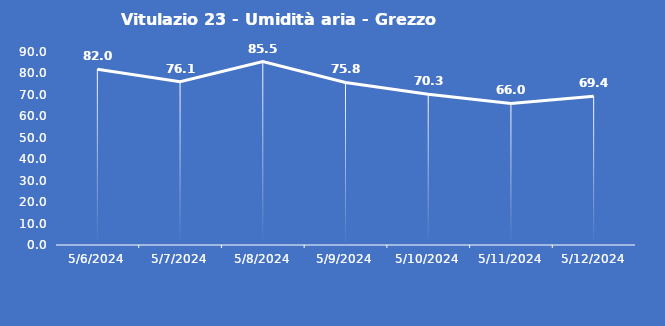
| Category | Vitulazio 23 - Umidità aria - Grezzo (%) |
|---|---|
| 5/6/24 | 82 |
| 5/7/24 | 76.1 |
| 5/8/24 | 85.5 |
| 5/9/24 | 75.8 |
| 5/10/24 | 70.3 |
| 5/11/24 | 66 |
| 5/12/24 | 69.4 |